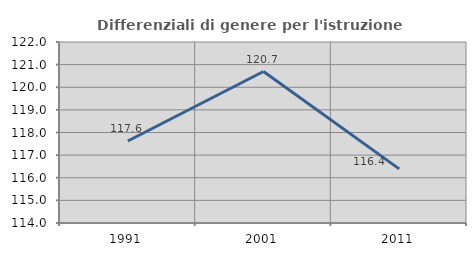
| Category | Differenziali di genere per l'istruzione superiore |
|---|---|
| 1991.0 | 117.624 |
| 2001.0 | 120.695 |
| 2011.0 | 116.392 |